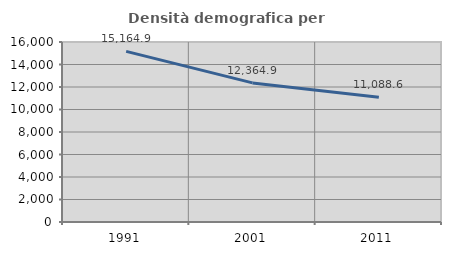
| Category | Densità demografica |
|---|---|
| 1991.0 | 15164.905 |
| 2001.0 | 12364.934 |
| 2011.0 | 11088.566 |